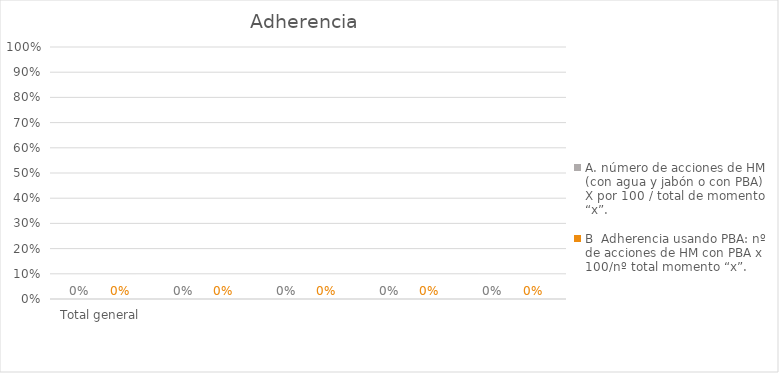
| Category | A. número de acciones de HM (con agua y jabón o con PBA) X por 100 / total de momento “x”. | B  Adherencia usando PBA: nº de acciones de HM con PBA x 100/nº total momento “x”. |
|---|---|---|
| Total general | 0 | 0 |